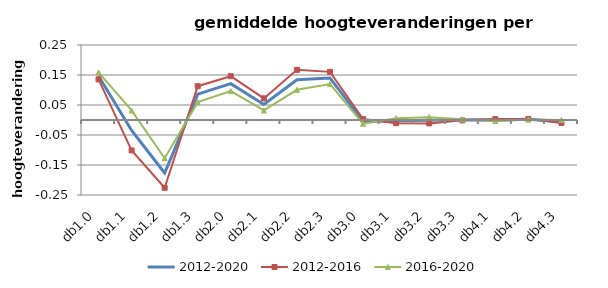
| Category | 2012-2020 | 2012-2016 | 2016-2020 |
|---|---|---|---|
| db1.0 | 0.147 | 0.135 | 0.159 |
| db1.1 | -0.035 | -0.101 | 0.032 |
| db1.2 | -0.177 | -0.226 | -0.127 |
| db1.3 | 0.086 | 0.113 | 0.06 |
| db2.0 | 0.121 | 0.146 | 0.096 |
| db2.1 | 0.052 | 0.072 | 0.032 |
| db2.2 | 0.134 | 0.167 | 0.101 |
| db2.3 | 0.14 | 0.16 | 0.12 |
| db3.0 | -0.005 | 0.003 | -0.012 |
| db3.1 | -0.002 | -0.011 | 0.006 |
| db3.2 | -0.001 | -0.011 | 0.01 |
| db3.3 | 0.001 | -0.001 | 0.002 |
| db4.1 | 0 | 0.003 | -0.004 |
| db4.2 | 0.002 | 0.004 | 0.001 |
| db4.3 | -0.005 | -0.01 | 0 |